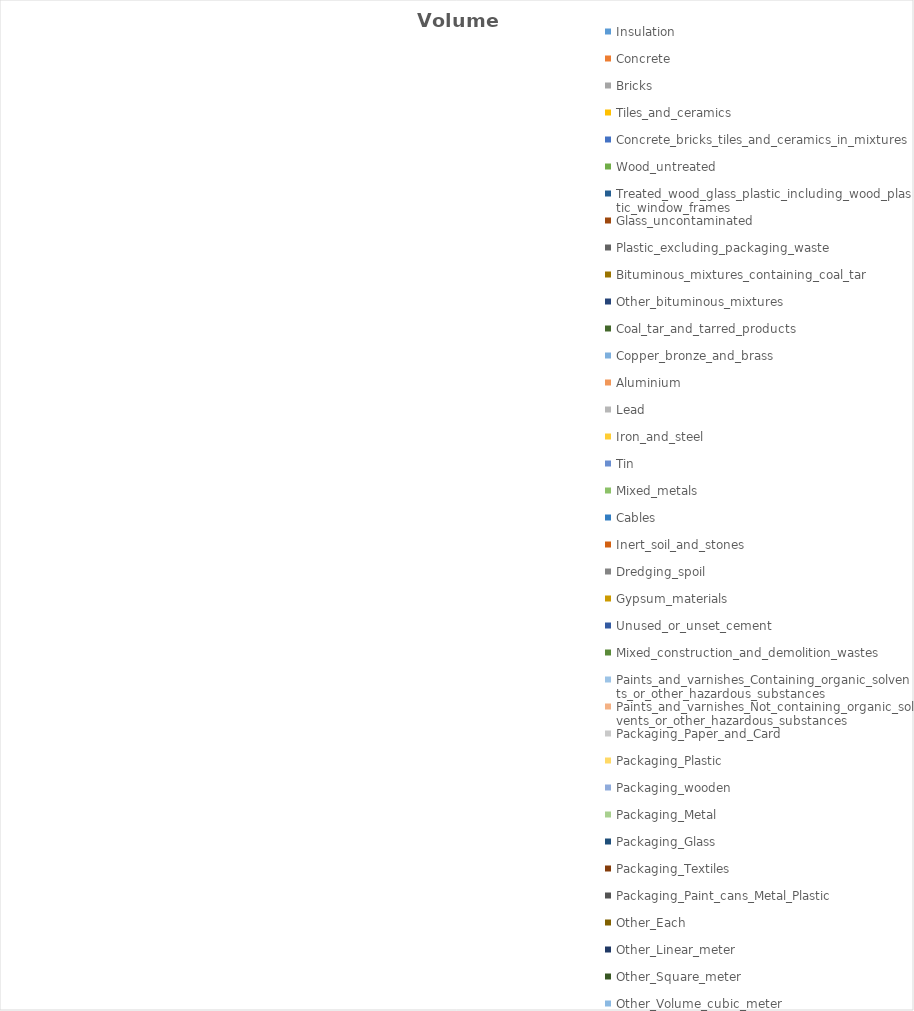
| Category | Volume (m3) |
|---|---|
| Insulation | 0 |
| Concrete | 0 |
| Bricks | 0 |
| Tiles_and_ceramics | 0 |
| Concrete_bricks_tiles_and_ceramics_in_mixtures | 0 |
| Wood_untreated | 0 |
| Treated_wood_glass_plastic_including_wood_plastic_window_frames | 0 |
| Glass_uncontaminated | 0 |
| Plastic_excluding_packaging_waste | 0 |
| Bituminous_mixtures_containing_coal_tar | 0 |
| Other_bituminous_mixtures | 0 |
| Coal_tar_and_tarred_products | 0 |
| Copper_bronze_and_brass | 0 |
| Aluminium | 0 |
| Lead | 0 |
| Iron_and_steel | 0 |
| Tin | 0 |
| Mixed_metals | 0 |
| Cables | 0 |
| Inert_soil_and_stones | 0 |
| Dredging_spoil | 0 |
| Gypsum_materials | 0 |
| Unused_or_unset_cement | 0 |
| Mixed_construction_and_demolition_wastes | 0 |
| Paints_and_varnishes_Containing_organic_solvents_or_other_hazardous_substances | 0 |
| Paints_and_varnishes_Not_containing_organic_solvents_or_other_hazardous_substances | 0 |
| Packaging_Paper_and_Card | 0 |
| Packaging_Plastic | 0 |
| Packaging_wooden | 0 |
| Packaging_Metal | 0 |
| Packaging_Glass | 0 |
| Packaging_Textiles | 0 |
| Packaging_Paint_cans_Metal_Plastic | 0 |
| Other_Each | 0 |
| Other_Linear_meter | 0 |
| Other_Square_meter | 0 |
| Other_Volume_cubic_meter | 0 |